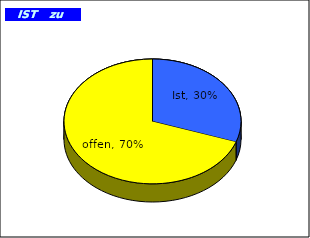
| Category | Sep 15 |
|---|---|
| Ist | 0.304 |
| offen | 0.696 |